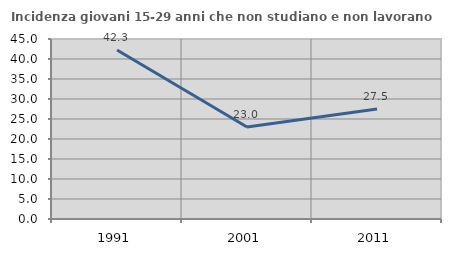
| Category | Incidenza giovani 15-29 anni che non studiano e non lavorano  |
|---|---|
| 1991.0 | 42.254 |
| 2001.0 | 22.989 |
| 2011.0 | 27.49 |